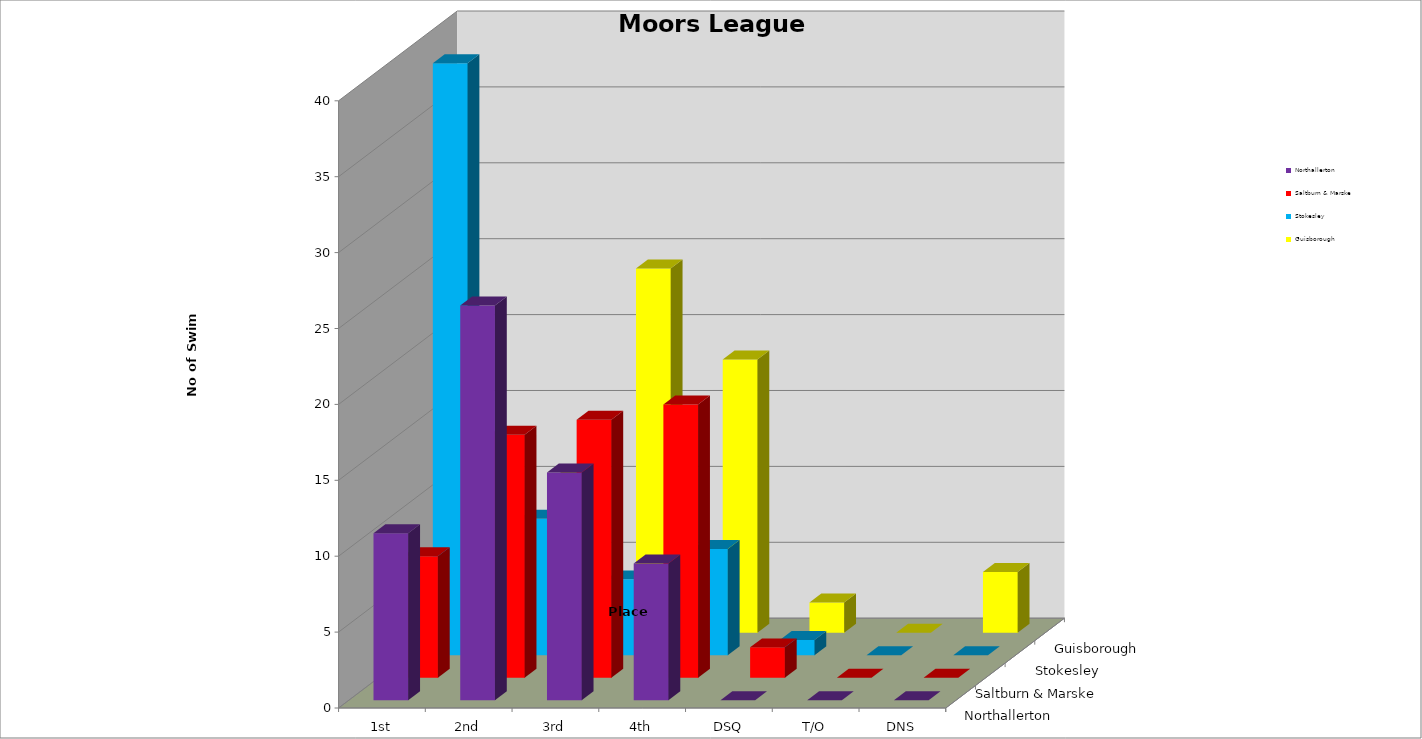
| Category | Northallerton | Saltburn & Marske | Stokesley | Guisborough |
|---|---|---|---|---|
| 1st | 11 | 8 | 39 | 3 |
| 2nd | 26 | 16 | 9 | 10 |
| 3rd | 15 | 17 | 5 | 24 |
| 4th | 9 | 18 | 7 | 18 |
| DSQ | 0 | 2 | 1 | 2 |
| T/O | 0 | 0 | 0 | 0 |
| DNS | 0 | 0 | 0 | 4 |